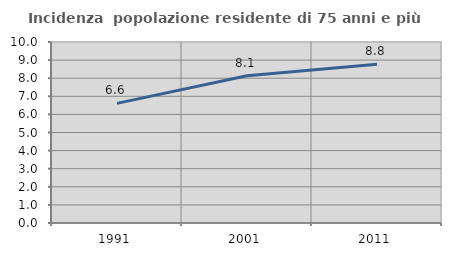
| Category | Incidenza  popolazione residente di 75 anni e più |
|---|---|
| 1991.0 | 6.611 |
| 2001.0 | 8.132 |
| 2011.0 | 8.768 |